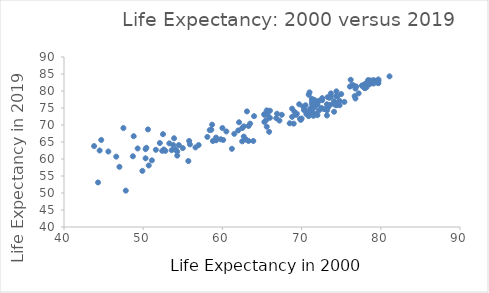
| Category | Series 0 |
|---|---|
| 55.0 | 63.2 |
| 73.5 | 78 |
| 72.2 | 77.1 |
| 49.3 | 63.1 |
| 74.6 | 76.5 |
| 74.1 | 76.6 |
| 71.9 | 76 |
| 79.7 | 83 |
| 78.2 | 81.6 |
| 65.5 | 71.4 |
| 70.9 | 73.2 |
| 70.5 | 75.8 |
| 65.6 | 74.3 |
| 74.5 | 76 |
| 68.8 | 74.8 |
| 77.7 | 81.4 |
| 70.3 | 74.4 |
| 56.6 | 63.4 |
| 65.7 | 73.1 |
| 66.0 | 72.1 |
| 75.4 | 76.8 |
| 45.6 | 62.2 |
| 71.5 | 75.9 |
| 72.2 | 74.3 |
| 71.6 | 75.1 |
| 51.6 | 62.7 |
| 43.8 | 63.8 |
| 71.0 | 74 |
| 58.7 | 70.1 |
| 52.8 | 62.4 |
| 79.1 | 82.2 |
| 44.3 | 53.1 |
| 51.1 | 59.6 |
| 76.8 | 80.7 |
| 71.6 | 77.4 |
| 73.7 | 79.3 |
| 61.5 | 67.4 |
| 52.1 | 64.7 |
| 78.0 | 80.8 |
| 50.3 | 62.9 |
| 74.4 | 78.6 |
| 76.8 | 77.8 |
| 78.7 | 83.1 |
| 75.0 | 79.1 |
| 64.0 | 72.6 |
| 52.4 | 62.4 |
| 76.9 | 81.3 |
| 59.8 | 65.8 |
| 73.2 | 72.8 |
| 74.5 | 78.4 |
| 69.8 | 71.8 |
| 72.5 | 75 |
| 54.3 | 62.2 |
| 54.5 | 64.1 |
| 70.9 | 78.9 |
| 47.0 | 57.7 |
| 50.6 | 68.7 |
| 65.9 | 68 |
| 77.6 | 81.6 |
| 78.9 | 82.5 |
| 58.1 | 66.5 |
| 59.2 | 65.5 |
| 69.4 | 73.3 |
| 78.1 | 81.7 |
| 59.2 | 66.3 |
| 78.2 | 81.1 |
| 72.0 | 72.9 |
| 66.8 | 72 |
| 54.3 | 61 |
| 50.3 | 60.2 |
| 63.0 | 65.7 |
| 57.0 | 64.1 |
| 70.0 | 71.9 |
| 71.3 | 76.4 |
| 79.7 | 82.3 |
| 62.1 | 70.8 |
| 67.2 | 71.3 |
| 72.6 | 77.3 |
| 68.8 | 72.4 |
| 76.4 | 81.8 |
| 78.6 | 82.6 |
| 79.4 | 83 |
| 74.2 | 76 |
| 81.1 | 84.3 |
| 72.6 | 77.9 |
| 63.1 | 74 |
| 53.9 | 66.1 |
| 55.7 | 59.4 |
| 77.9 | 81 |
| 66.0 | 74.2 |
| 58.4 | 68.5 |
| 70.2 | 75.4 |
| 74.6 | 76.4 |
| 47.8 | 50.7 |
| 53.8 | 64.1 |
| 74.4 | 75.8 |
| 72.0 | 76 |
| 78.2 | 82.4 |
| 58.8 | 65.3 |
| 44.7 | 65.6 |
| 72.8 | 74.7 |
| 71.0 | 79.6 |
| 52.6 | 62.8 |
| 77.9 | 81.9 |
| 62.0 | 68.4 |
| 71.2 | 74.1 |
| 74.4 | 76 |
| 61.2 | 63 |
| 60.5 | 68.1 |
| 73.6 | 75.9 |
| 69.3 | 73 |
| 50.7 | 58.1 |
| 60.0 | 69.1 |
| 53.3 | 64.6 |
| 65.3 | 70.9 |
| 78.0 | 81.8 |
| 78.6 | 82 |
| 73.3 | 75 |
| 50.4 | 63.3 |
| 53.6 | 62.6 |
| 78.5 | 82.6 |
| 69.1 | 73.9 |
| 60.1 | 65.6 |
| 77.2 | 79.3 |
| 63.3 | 65.3 |
| 74.8 | 75.8 |
| 74.4 | 79.9 |
| 69.0 | 70.4 |
| 73.7 | 78.3 |
| 76.6 | 81.6 |
| 71.3 | 77.2 |
| 76.2 | 83.3 |
| 66.9 | 73.3 |
| 71.1 | 74.8 |
| 71.4 | 75.6 |
| 65.3 | 73.2 |
| 47.5 | 69.1 |
| 73.2 | 74.3 |
| 70.6 | 73.2 |
| 68.5 | 70.5 |
| 63.5 | 70.4 |
| 70.5 | 74.3 |
| 58.6 | 68.6 |
| 71.4 | 75.9 |
| 71.9 | 73.3 |
| 48.7 | 60.8 |
| 78.4 | 83.2 |
| 73.3 | 78.2 |
| 76.1 | 81.3 |
| 62.5 | 65.2 |
| 49.9 | 56.5 |
| 55.8 | 65.3 |
| 54.1 | 62.8 |
| 79.1 | 83.2 |
| 71.9 | 76.9 |
| 62.5 | 69.1 |
| 69.9 | 71.5 |
| 79.6 | 82.4 |
| 79.7 | 83.4 |
| 71.5 | 72.7 |
| 65.6 | 69.5 |
| 71.3 | 77.7 |
| 62.7 | 69.6 |
| 55.9 | 64.3 |
| 70.9 | 72.6 |
| 69.7 | 76.1 |
| 74.1 | 77 |
| 74.4 | 78.6 |
| 63.3 | 69.7 |
| 48.8 | 66.7 |
| 67.5 | 73 |
| 73.2 | 76.1 |
| 77.9 | 81.4 |
| 52.5 | 67.3 |
| 76.7 | 78.5 |
| 74.8 | 77.1 |
| 65.3 | 73 |
| 63.9 | 65.3 |
| 74.1 | 73.9 |
| 71.4 | 73.7 |
| 62.7 | 66.6 |
| 44.5 | 62.5 |
| 46.6 | 60.7 |